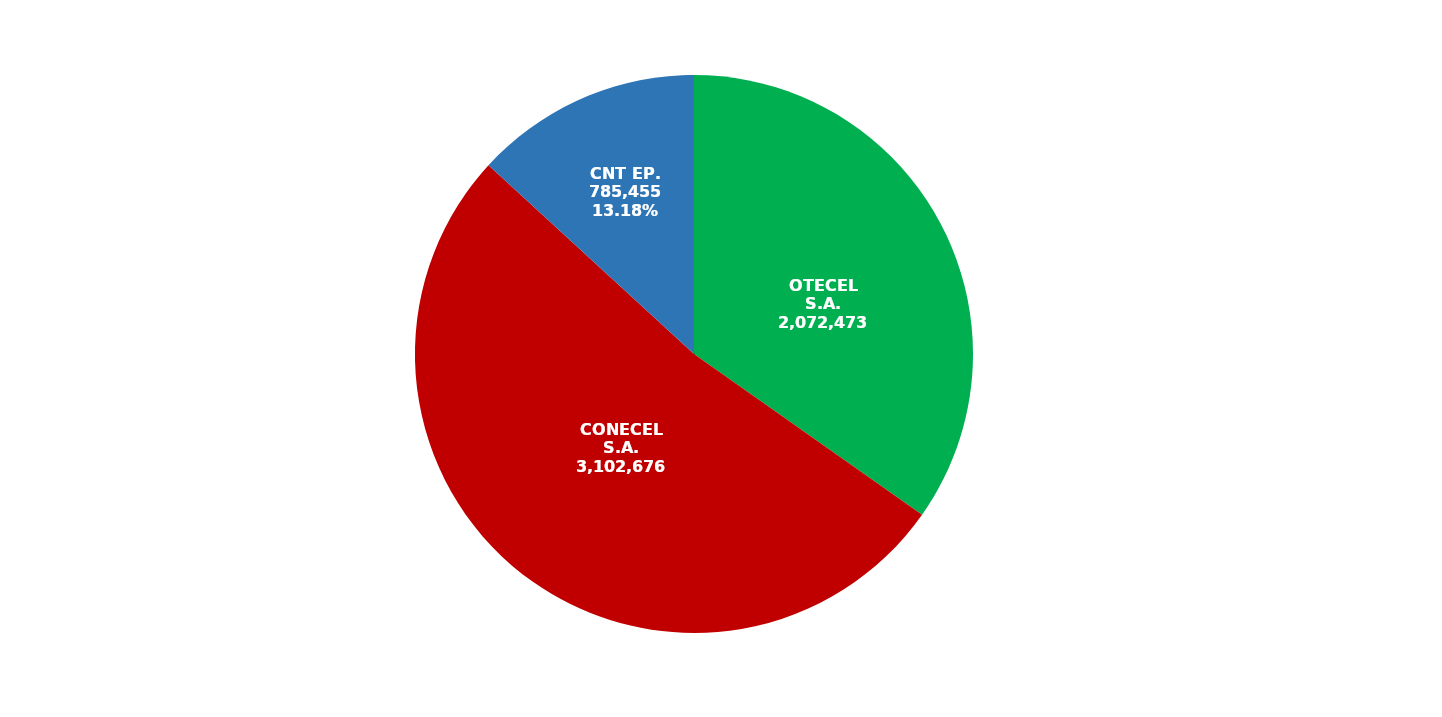
| Category | Series 0 |
|---|---|
| OTECEL S.A. | 2072473 |
| CONECEL S.A. | 3102676 |
| CNT EP. | 785455 |